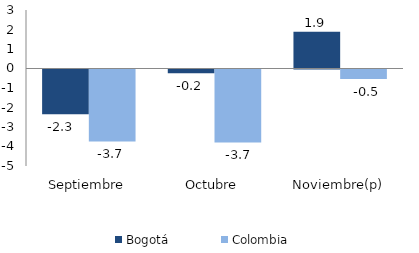
| Category | Bogotá | Colombia |
|---|---|---|
| Septiembre | -2.292 | -3.687 |
| Octubre | -0.198 | -3.744 |
| Noviembre(p) | 1.881 | -0.485 |